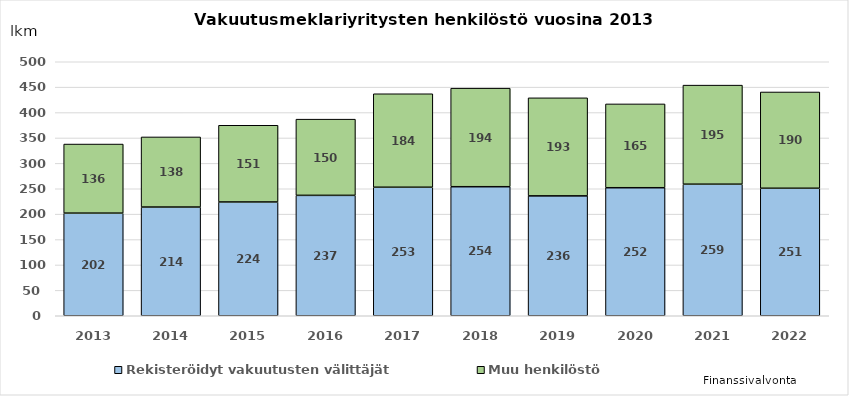
| Category | Rekisteröidyt vakuutusten välittäjät  | Muu henkilöstö |
|---|---|---|
| 2013.0 | 202 | 136 |
| 2014.0 | 214 | 138 |
| 2015.0 | 224 | 151 |
| 2016.0 | 237 | 150 |
| 2017.0 | 253 | 184 |
| 2018.0 | 254 | 194 |
| 2019.0 | 236 | 193 |
| 2020.0 | 252 | 165 |
| 2021.0 | 259 | 195 |
| 2022.0 | 251 | 189.5 |